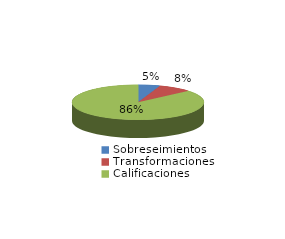
| Category | Series 0 |
|---|---|
| Sobreseimientos | 57 |
| Transformaciones | 88 |
| Calificaciones | 923 |